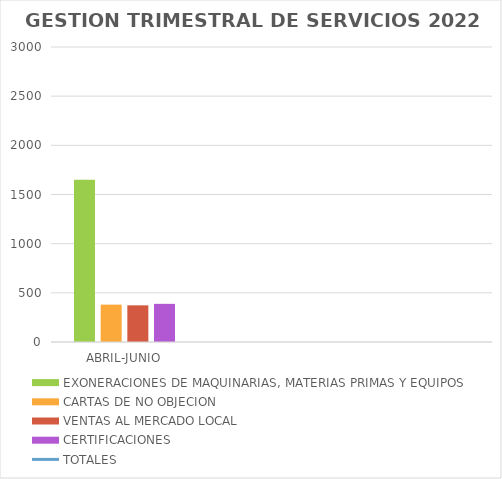
| Category | EXONERACIONES DE MAQUINARIAS, MATERIAS PRIMAS Y EQUIPOS | CARTAS DE NO OBJECION | VENTAS AL MERCADO LOCAL | CERTIFICACIONES |
|---|---|---|---|---|
| ABRIL-JUNIO | 1651 | 380 | 373 | 388 |